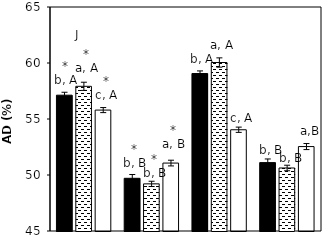
| Category |    A. brasilense |    A. chroococcum |    CK |
|---|---|---|---|
| aCO2-Bt | 57.127 | 57.918 | 55.795 |
| aCO2-XIANYU | 49.705 | 49.208 | 51.065 |
| eCO2-Bt | 59.059 | 60.043 | 54.04 |
| eCO2-XIANYU | 51.106 | 50.626 | 52.539 |